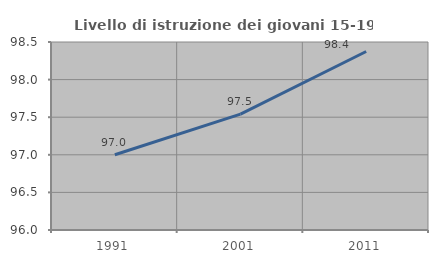
| Category | Livello di istruzione dei giovani 15-19 anni |
|---|---|
| 1991.0 | 97 |
| 2001.0 | 97.541 |
| 2011.0 | 98.374 |